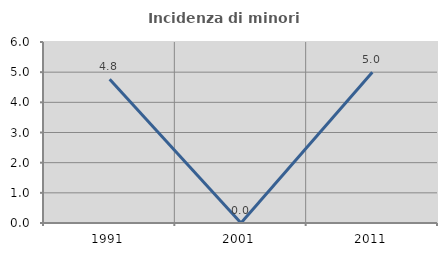
| Category | Incidenza di minori stranieri |
|---|---|
| 1991.0 | 4.762 |
| 2001.0 | 0 |
| 2011.0 | 5 |